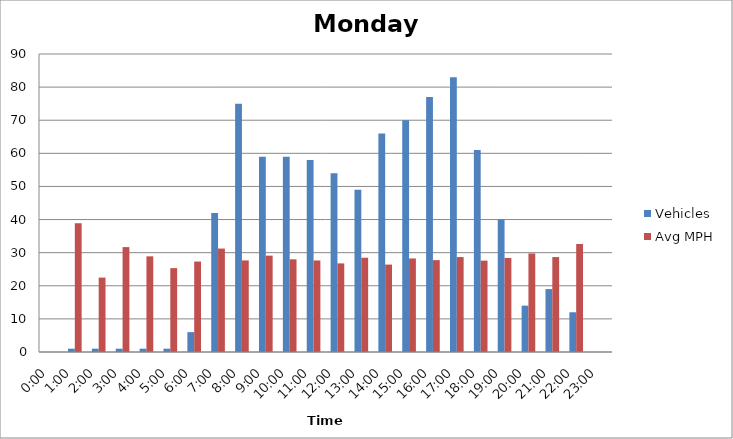
| Category | Vehicles | Avg MPH |
|---|---|---|
| 0:00 | 0 | 0 |
| 1:00 | 1 | 38.89 |
| 2:00 | 1 | 22.47 |
| 3:00 | 1 | 31.68 |
| 4:00 | 1 | 28.89 |
| 5:00 | 1 | 25.33 |
| 6:00 | 6 | 27.32 |
| 7:00 | 42 | 31.24 |
| 8:00 | 75 | 27.66 |
| 9:00 | 59 | 29.1 |
| 10:00 | 59 | 27.99 |
| 11:00 | 58 | 27.64 |
| 12:00 | 54 | 26.76 |
| 13:00 | 49 | 28.47 |
| 14:00 | 66 | 26.4 |
| 15:00 | 70 | 28.25 |
| 16:00 | 77 | 27.75 |
| 17:00 | 83 | 28.67 |
| 18:00 | 61 | 27.59 |
| 19:00 | 40 | 28.4 |
| 20:00 | 14 | 29.76 |
| 21:00 | 19 | 28.67 |
| 22:00 | 12 | 32.61 |
| 23:00 | 0 | 0 |